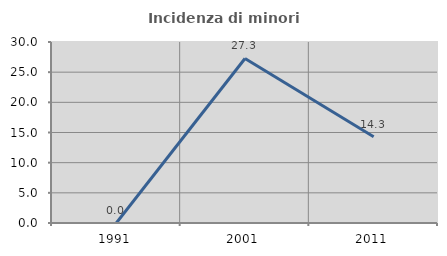
| Category | Incidenza di minori stranieri |
|---|---|
| 1991.0 | 0 |
| 2001.0 | 27.273 |
| 2011.0 | 14.286 |